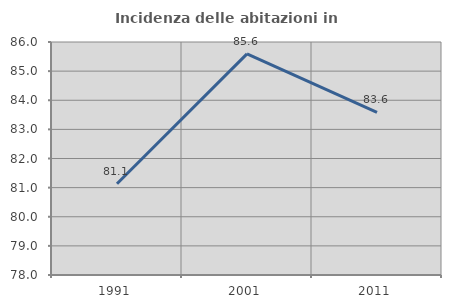
| Category | Incidenza delle abitazioni in proprietà  |
|---|---|
| 1991.0 | 81.133 |
| 2001.0 | 85.594 |
| 2011.0 | 83.582 |